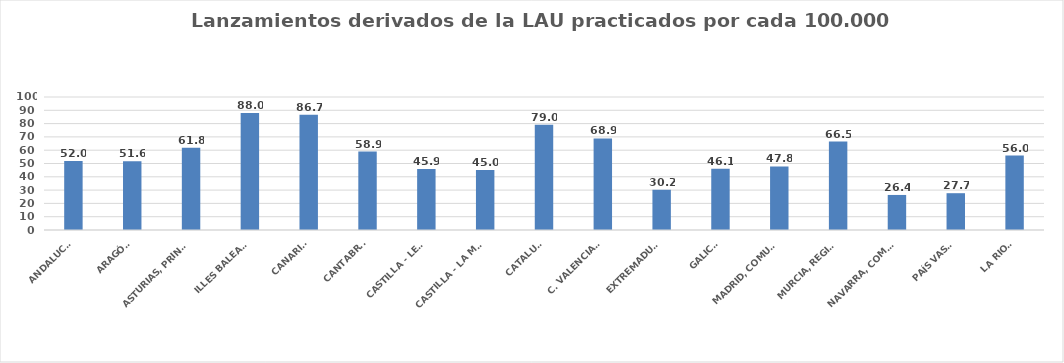
| Category | Series 0 |
|---|---|
| ANDALUCÍA | 51.97 |
| ARAGÓN | 51.647 |
| ASTURIAS, PRINCIPADO | 61.81 |
| ILLES BALEARS | 88.046 |
| CANARIAS | 86.651 |
| CANTABRIA | 58.934 |
| CASTILLA - LEÓN | 45.94 |
| CASTILLA - LA MANCHA | 45.049 |
| CATALUÑA | 79.049 |
| C. VALENCIANA | 68.871 |
| EXTREMADURA | 30.243 |
| GALICIA | 46.089 |
| MADRID, COMUNIDAD | 47.761 |
| MURCIA, REGIÓN | 66.454 |
| NAVARRA, COM. FORAL | 26.351 |
| PAÍS VASCO | 27.67 |
| LA RIOJA | 55.956 |